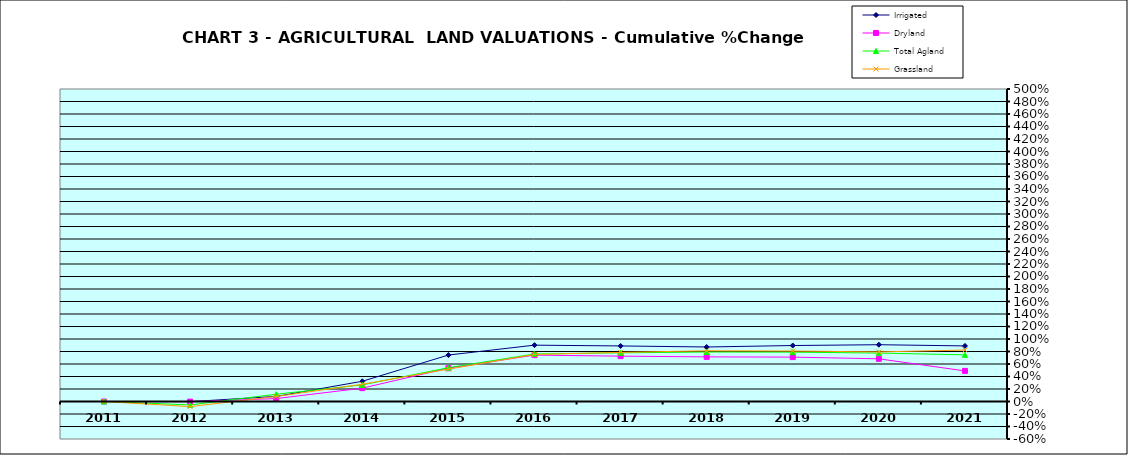
| Category | Irrigated | Dryland | Total Agland | Grassland |
|---|---|---|---|---|
| 2011.0 | 0 | 0 | 0 | 0 |
| 2012.0 | -0.002 | -0.002 | -0.055 | -0.082 |
| 2013.0 | 0.081 | 0.047 | 0.116 | 0.08 |
| 2014.0 | 0.324 | 0.214 | 0.266 | 0.276 |
| 2015.0 | 0.743 | 0.533 | 0.541 | 0.518 |
| 2016.0 | 0.901 | 0.742 | 0.761 | 0.752 |
| 2017.0 | 0.889 | 0.726 | 0.779 | 0.786 |
| 2018.0 | 0.872 | 0.714 | 0.792 | 0.811 |
| 2019.0 | 0.896 | 0.71 | 0.79 | 0.807 |
| 2020.0 | 0.909 | 0.683 | 0.775 | 0.793 |
| 2021.0 | 0.889 | 0.489 | 0.746 | 0.823 |